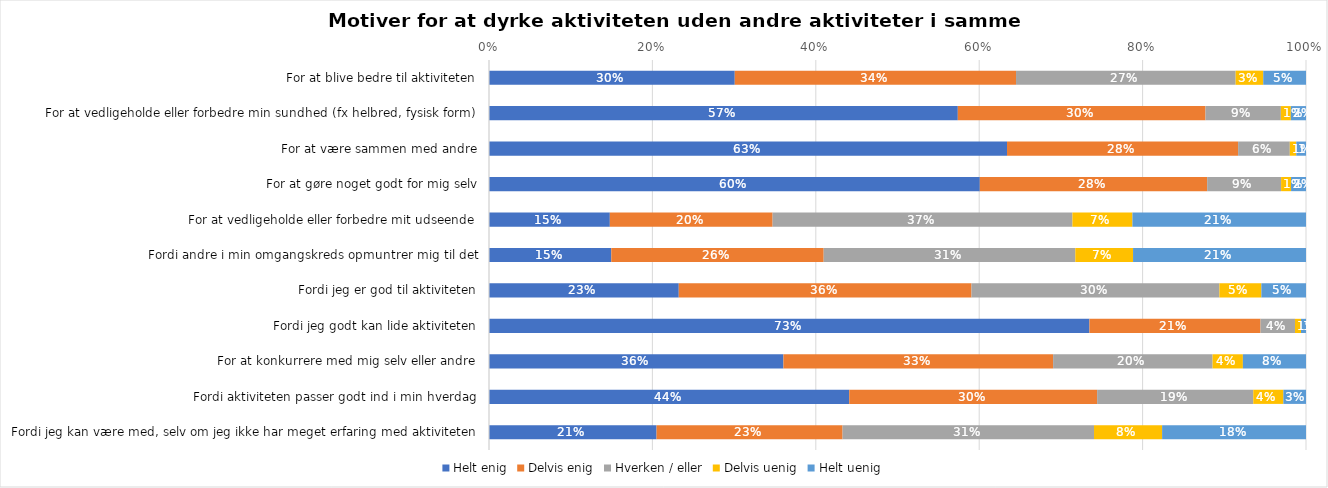
| Category | Helt enig | Delvis enig | Hverken / eller | Delvis uenig | Helt uenig |
|---|---|---|---|---|---|
| For at blive bedre til aktiviteten | 0.301 | 0.344 | 0.269 | 0.034 | 0.052 |
| For at vedligeholde eller forbedre min sundhed (fx helbred, fysisk form) | 0.574 | 0.303 | 0.092 | 0.012 | 0.019 |
| For at være sammen med andre | 0.634 | 0.283 | 0.063 | 0.008 | 0.012 |
| For at gøre noget godt for mig selv | 0.601 | 0.278 | 0.09 | 0.012 | 0.018 |
| For at vedligeholde eller forbedre mit udseende | 0.148 | 0.199 | 0.367 | 0.073 | 0.212 |
| Fordi andre i min omgangskreds opmuntrer mig til det | 0.15 | 0.26 | 0.308 | 0.071 | 0.212 |
| Fordi jeg er god til aktiviteten | 0.232 | 0.358 | 0.303 | 0.051 | 0.055 |
| Fordi jeg godt kan lide aktiviteten | 0.735 | 0.209 | 0.042 | 0.007 | 0.006 |
| For at konkurrere med mig selv eller andre | 0.36 | 0.33 | 0.195 | 0.037 | 0.077 |
| Fordi aktiviteten passer godt ind i min hverdag | 0.441 | 0.303 | 0.191 | 0.037 | 0.028 |
| Fordi jeg kan være med, selv om jeg ikke har meget erfaring med aktiviteten | 0.205 | 0.228 | 0.308 | 0.083 | 0.176 |